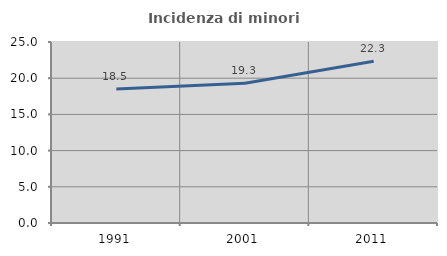
| Category | Incidenza di minori stranieri |
|---|---|
| 1991.0 | 18.519 |
| 2001.0 | 19.298 |
| 2011.0 | 22.344 |